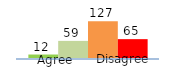
| Category | Series 0 | Series 1 | Series 2 | Series 3 |
|---|---|---|---|---|
| 0 | 12 | 59 | 127 | 65 |